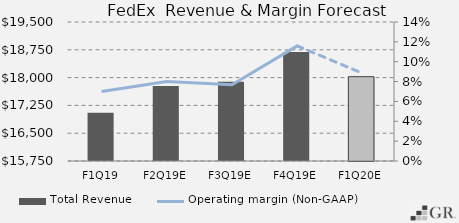
| Category | Total Revenue |
|---|---|
|  F1Q19  | 17052 |
|  F2Q19E  | 17772.5 |
|  F3Q19E  | 17888.8 |
|  F4Q19E  | 18692.3 |
|  F1Q20E  | 18024.89 |